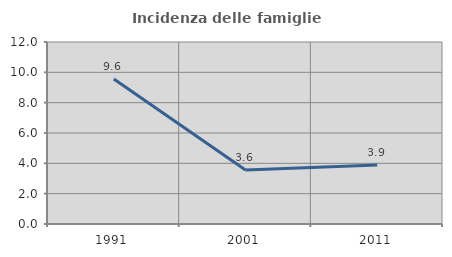
| Category | Incidenza delle famiglie numerose |
|---|---|
| 1991.0 | 9.56 |
| 2001.0 | 3.566 |
| 2011.0 | 3.892 |